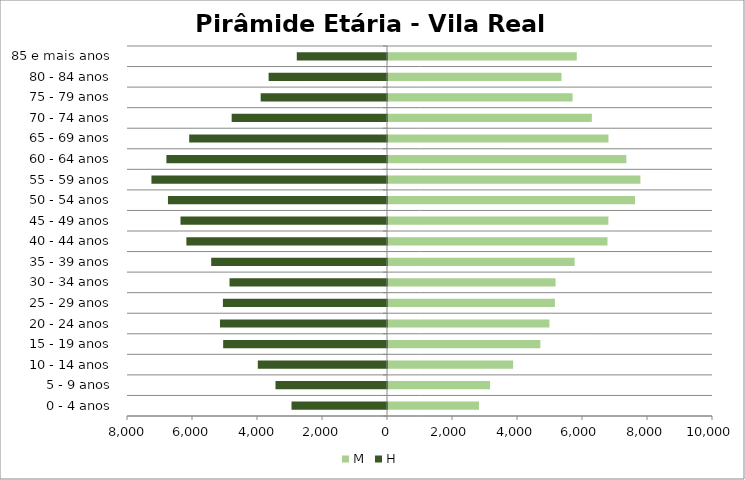
| Category | M | H |
|---|---|---|
| 0 - 4 anos | 2800 | -2938 |
| 5 - 9 anos | 3141 | -3431 |
| 10 - 14 anos | 3850 | -3975 |
| 15 - 19 anos | 4688 | -5041 |
| 20 - 24 anos | 4966 | -5139 |
| 25 - 29 anos | 5137 | -5049 |
| 30 - 34 anos | 5155 | -4845 |
| 35 - 39 anos | 5742 | -5409 |
| 40 - 44 anos | 6753 | -6173 |
| 45 - 49 anos | 6781 | -6354 |
| 50 - 54 anos | 7600 | -6740 |
| 55 - 59 anos | 7766 | -7248 |
| 60 - 64 anos | 7333 | -6787 |
| 65 - 69 anos | 6783 | -6086 |
| 70 - 74 anos | 6272 | -4780 |
| 75 - 79 anos | 5679 | -3887 |
| 80 - 84 anos | 5338 | -3643 |
| 85 e mais anos | 5809 | -2776 |